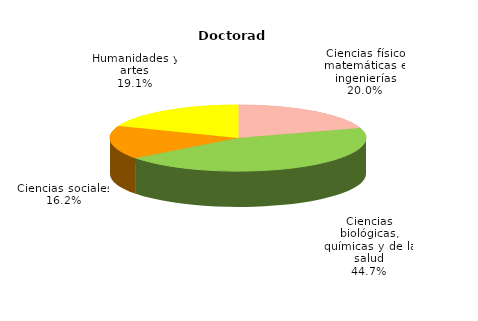
| Category | Series 0 |
|---|---|
| Ciencias físico matemáticas e ingenierías | 1087 |
| Ciencias biológicas, químicas y de la salud | 2421 |
| Ciencias sociales | 877 |
| Humanidades y artes | 1034 |